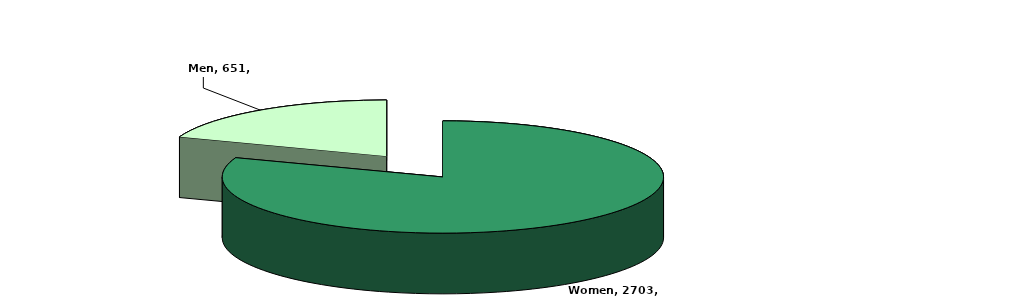
| Category | Number |
|---|---|
| Women | 2703 |
| Men | 651 |